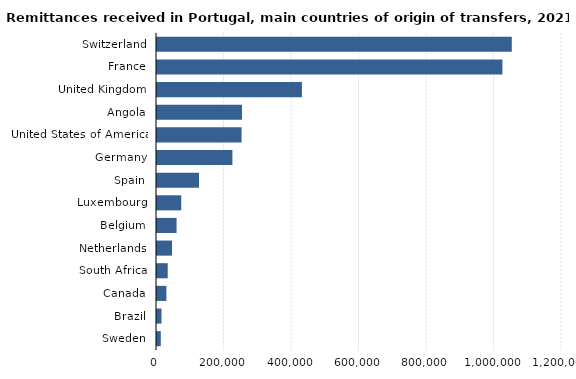
| Category | Series 2 |
|---|---|
| Switzerland | 1051260 |
| France | 1023450 |
| United Kingdom | 429380 |
| Angola | 251820 |
| United States of America | 250540 |
| Germany | 223440 |
| Spain | 124440 |
| Luxembourg | 71850 |
| Belgium | 58050 |
| Netherlands | 44560 |
| South Africa | 31770 |
| Canada | 27850 |
| Brazil | 13370 |
| Sweden | 11170 |